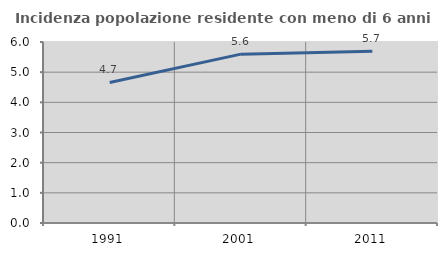
| Category | Incidenza popolazione residente con meno di 6 anni |
|---|---|
| 1991.0 | 4.66 |
| 2001.0 | 5.598 |
| 2011.0 | 5.691 |